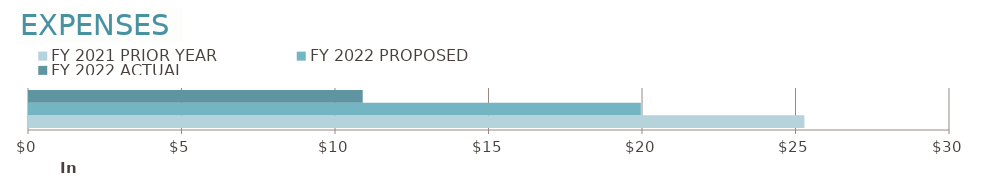
| Category | FY 2021 | FY 2022 |
|---|---|---|
| 0 | 25258.85 | 10869.84 |